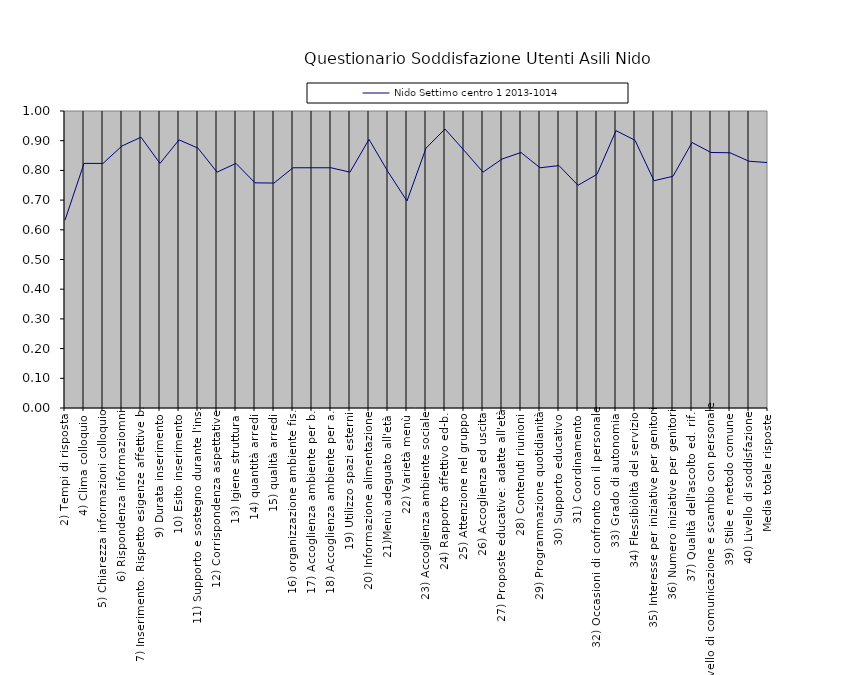
| Category | Nido Settimo centro 1 2013-1014 |
|---|---|
| 2) Tempi di risposta | 0.632 |
| 4) Clima colloquio | 0.824 |
| 5) Chiarezza informazioni colloquio | 0.824 |
| 6) Rispondenza informaziomni | 0.882 |
| 7) Inserimento. Rispetto esigenze affettive b. | 0.912 |
| 9) Durata inserimento | 0.824 |
| 10) Esito inserimento | 0.903 |
| 11) Supporto e sostegno durante l'ins. | 0.875 |
| 12) Corrispondenza aspettative | 0.794 |
| 13) Igiene struttura | 0.824 |
| 14) quantità arredi | 0.758 |
| 15) qualità arredi | 0.757 |
| 16) organizzazione ambiente fis. | 0.809 |
| 17) Accoglienza ambiente per b. | 0.809 |
| 18) Accoglienza ambiente per a. | 0.809 |
| 19) Utilizzo spazi esterni | 0.794 |
| 20) Informazione alimentazione | 0.904 |
| 21)Menù adeguato all'età | 0.795 |
| 22) Varietà menù | 0.697 |
| 23) Accoglienza ambiente sociale | 0.875 |
| 24) Rapporto affettivo ed-b. | 0.939 |
| 25) Attenzione nel gruppo | 0.868 |
| 26) Accoglienza ed uscita | 0.794 |
| 27) Proposte educative: adatte all'età | 0.838 |
| 28) Contenuti riunioni | 0.86 |
| 29) Programmazione quotidianità | 0.809 |
| 30) Supporto educativo | 0.816 |
| 31) Coordinamento | 0.75 |
| 32) Occasioni di confronto con il personale | 0.787 |
| 33) Grado di autonomia | 0.934 |
| 34) Flessibiòlità del servizio | 0.902 |
| 35) Interesse per iniziative per genitori | 0.765 |
| 36) Numero iniziative per genitori | 0.78 |
| 37) Qualità dell'ascolto ed. rif. | 0.894 |
| 38) Livello di comunicazione e scambio con personale | 0.86 |
| 39) Stile e metodo comune | 0.859 |
| 40) Livello di soddisfazione | 0.831 |
| Media totale risposte | 0.826 |